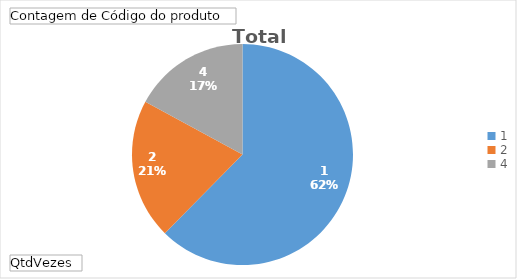
| Category | Total |
|---|---|
| 1 | 73 |
| 2 | 24 |
| 4 | 20 |